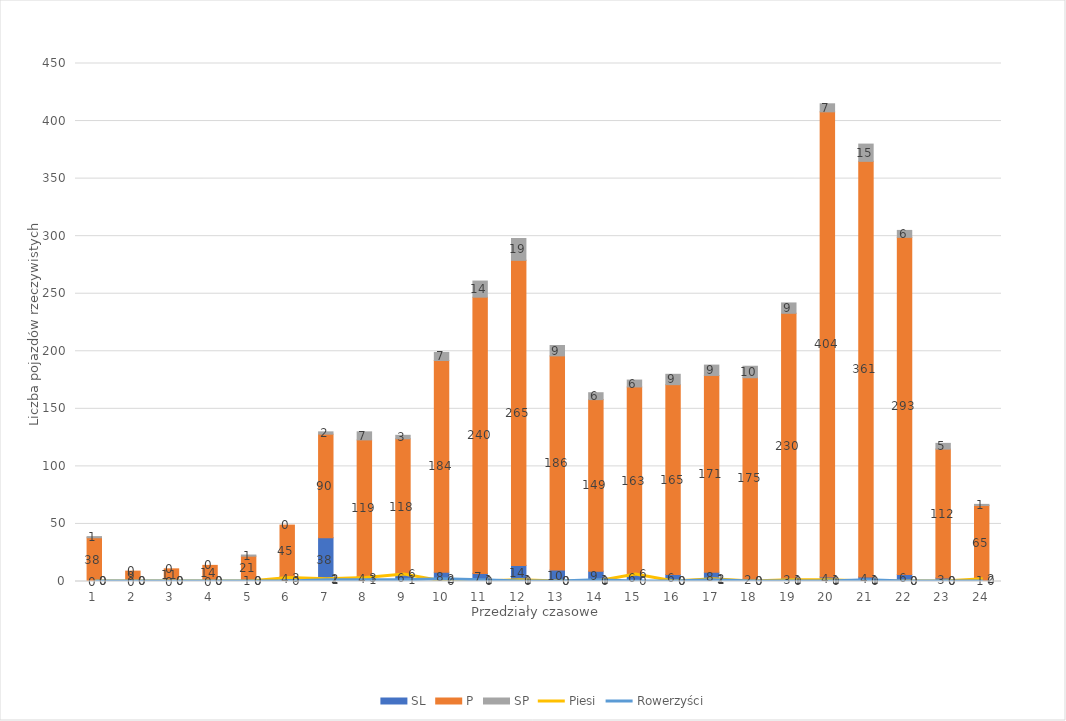
| Category | SL | P | SP |
|---|---|---|---|
| 0 | 0 | 38 | 1 |
| 1 | 0 | 9 | 0 |
| 2 | 0 | 11 | 0 |
| 3 | 0 | 14 | 0 |
| 4 | 1 | 21 | 1 |
| 5 | 4 | 45 | 0 |
| 6 | 38 | 90 | 2 |
| 7 | 4 | 119 | 7 |
| 8 | 6 | 118 | 3 |
| 9 | 8 | 184 | 7 |
| 10 | 7 | 240 | 14 |
| 11 | 14 | 265 | 19 |
| 12 | 10 | 186 | 9 |
| 13 | 9 | 149 | 6 |
| 14 | 6 | 163 | 6 |
| 15 | 6 | 165 | 9 |
| 16 | 8 | 171 | 9 |
| 17 | 2 | 175 | 10 |
| 18 | 3 | 230 | 9 |
| 19 | 4 | 404 | 7 |
| 20 | 4 | 361 | 15 |
| 21 | 6 | 293 | 6 |
| 22 | 3 | 112 | 5 |
| 23 | 1 | 65 | 1 |